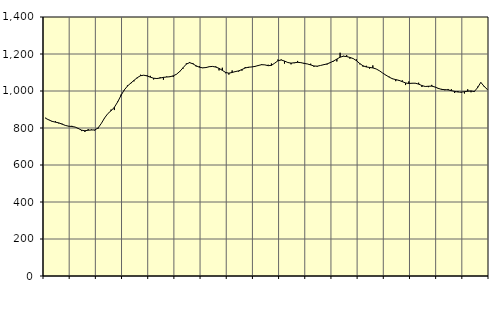
| Category | Piggar | Series 1 |
|---|---|---|
| nan | 855.5 | 852.33 |
| 87.0 | 844.7 | 843.5 |
| 87.0 | 833.2 | 835.86 |
| 87.0 | 836.4 | 831.51 |
| nan | 824.9 | 827.8 |
| 88.0 | 823.3 | 821.09 |
| 88.0 | 813.3 | 814.09 |
| 88.0 | 810.9 | 809.79 |
| nan | 811.6 | 808.12 |
| 89.0 | 804.9 | 805.28 |
| 89.0 | 800.1 | 797.21 |
| 89.0 | 783.3 | 788.25 |
| nan | 778.5 | 785.25 |
| 90.0 | 793.7 | 787.85 |
| 90.0 | 791.8 | 789.19 |
| 90.0 | 786.5 | 789.55 |
| nan | 796.2 | 799.88 |
| 91.0 | 824.5 | 824.07 |
| 91.0 | 853 | 853.96 |
| 91.0 | 877.2 | 877.69 |
| nan | 899.6 | 893.27 |
| 92.0 | 897 | 911.98 |
| 92.0 | 942.5 | 940.43 |
| 92.0 | 980.3 | 974.82 |
| nan | 1003.2 | 1005.1 |
| 93.0 | 1030.4 | 1026.45 |
| 93.0 | 1039.7 | 1042.43 |
| 93.0 | 1052.3 | 1057.24 |
| nan | 1069 | 1072.12 |
| 94.0 | 1087.9 | 1082.55 |
| 94.0 | 1085.5 | 1085.31 |
| 94.0 | 1084.8 | 1081.5 |
| nan | 1081.8 | 1074.77 |
| 95.0 | 1062.5 | 1069.05 |
| 95.0 | 1069.1 | 1067.45 |
| 95.0 | 1074.4 | 1070.1 |
| nan | 1060.9 | 1073.81 |
| 96.0 | 1078.2 | 1075.52 |
| 96.0 | 1078.7 | 1077.09 |
| 96.0 | 1076.2 | 1081.95 |
| nan | 1091.3 | 1090.7 |
| 97.0 | 1103.6 | 1105.63 |
| 97.0 | 1121 | 1125.7 |
| 97.0 | 1149.1 | 1145.35 |
| nan | 1156.8 | 1153.23 |
| 98.0 | 1151.4 | 1146.89 |
| 98.0 | 1132.5 | 1136.18 |
| 98.0 | 1133.9 | 1128.53 |
| nan | 1123.9 | 1125.25 |
| 99.0 | 1125.8 | 1126.72 |
| 99.0 | 1132.9 | 1131.29 |
| 99.0 | 1133.7 | 1132.92 |
| nan | 1132.7 | 1129.38 |
| 0.0 | 1111.4 | 1122.52 |
| 0.0 | 1125.7 | 1111.62 |
| 0.0 | 1096.1 | 1100.26 |
| nan | 1088.8 | 1096.35 |
| 1.0 | 1111.1 | 1100.13 |
| 1.0 | 1102.5 | 1105.09 |
| 1.0 | 1104.9 | 1108.84 |
| nan | 1110 | 1116.12 |
| 2.0 | 1129.6 | 1124.53 |
| 2.0 | 1125.5 | 1128.58 |
| 2.0 | 1129.5 | 1130 |
| nan | 1134.3 | 1133 |
| 3.0 | 1134.9 | 1137.9 |
| 3.0 | 1144.6 | 1142.18 |
| 3.0 | 1141 | 1141.28 |
| nan | 1142 | 1136.75 |
| 4.0 | 1148.6 | 1138.54 |
| 4.0 | 1151 | 1150.26 |
| 4.0 | 1170.2 | 1163.47 |
| nan | 1170 | 1167.6 |
| 5.0 | 1148.1 | 1161.96 |
| 5.0 | 1155.3 | 1154.13 |
| 5.0 | 1144.1 | 1150.6 |
| nan | 1150.6 | 1152.62 |
| 6.0 | 1162.5 | 1154.97 |
| 6.0 | 1154.2 | 1153.21 |
| 6.0 | 1151.7 | 1149.31 |
| nan | 1146.5 | 1146.07 |
| 7.0 | 1147.5 | 1140.99 |
| 7.0 | 1131 | 1135.23 |
| 7.0 | 1131.3 | 1134.19 |
| nan | 1138.3 | 1138.01 |
| 8.0 | 1143.9 | 1142.24 |
| 8.0 | 1143.3 | 1146.4 |
| 8.0 | 1156.1 | 1153.45 |
| nan | 1160 | 1162.23 |
| 9.0 | 1159.8 | 1172.54 |
| 9.0 | 1206.7 | 1182.73 |
| 9.0 | 1190.2 | 1188.09 |
| nan | 1193.8 | 1186.09 |
| 10.0 | 1174.6 | 1181.37 |
| 10.0 | 1176.1 | 1175.31 |
| 10.0 | 1170.8 | 1163.79 |
| nan | 1144.3 | 1148.43 |
| 11.0 | 1131.4 | 1136.17 |
| 11.0 | 1136.2 | 1129.91 |
| 11.0 | 1120.8 | 1127.41 |
| nan | 1138.3 | 1124.81 |
| 12.0 | 1119.3 | 1119.34 |
| 12.0 | 1109 | 1109.51 |
| 12.0 | 1096.9 | 1097.07 |
| nan | 1084.8 | 1085.88 |
| 13.0 | 1077.5 | 1074.86 |
| 13.0 | 1068 | 1066.1 |
| 13.0 | 1053.2 | 1061.66 |
| nan | 1059.4 | 1057.35 |
| 14.0 | 1057.5 | 1050.66 |
| 14.0 | 1032.1 | 1043.61 |
| 14.0 | 1051.7 | 1040.53 |
| nan | 1040.9 | 1042.1 |
| 15.0 | 1040.8 | 1041.98 |
| 15.0 | 1044.8 | 1037.05 |
| 15.0 | 1021.6 | 1029.44 |
| nan | 1024.2 | 1024.35 |
| 16.0 | 1020.9 | 1025.73 |
| 16.0 | 1033.1 | 1026.33 |
| 16.0 | 1021.2 | 1021.64 |
| nan | 1010.6 | 1014.22 |
| 17.0 | 1011.4 | 1008.63 |
| 17.0 | 1004 | 1007.21 |
| 17.0 | 1010.9 | 1005.82 |
| nan | 1009.4 | 1001.96 |
| 18.0 | 989.2 | 997.85 |
| 18.0 | 999.6 | 994.56 |
| 18.0 | 991.2 | 994.17 |
| nan | 986.6 | 996.3 |
| 19.0 | 1009 | 998.69 |
| 19.0 | 993.2 | 1000.35 |
| 19.0 | 1000.4 | 996.9 |
| nan | 1023.2 | 1017.8 |
| 20.0 | 1045.6 | 1046.65 |
| 20.0 | 1022.8 | 1025.21 |
| 20.0 | 1006.5 | 1008.28 |